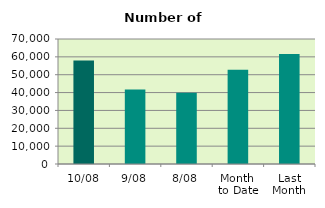
| Category | Series 0 |
|---|---|
| 10/08 | 58000 |
| 9/08 | 41700 |
| 8/08 | 39842 |
| Month 
to Date | 52723.75 |
| Last
Month | 61549.619 |